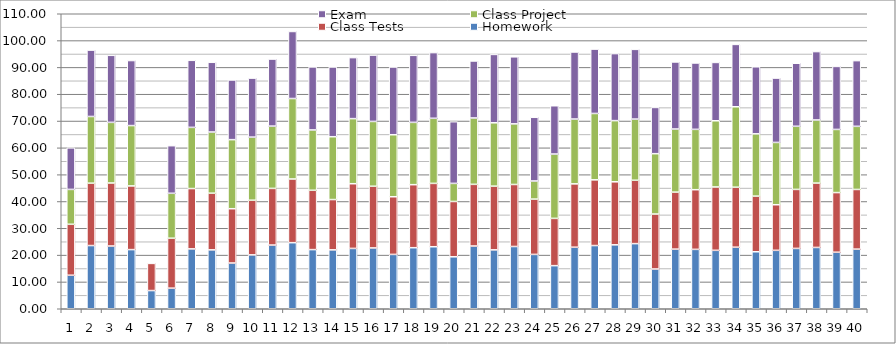
| Category | Homework | Class Tests | Class Project | Exam |
|---|---|---|---|---|
| 0 | 12.5 | 19 | 13 | 15.5 |
| 1 | 23.571 | 23.25 | 24.875 | 24.75 |
| 2 | 23.393 | 23.5 | 22.604 | 25 |
| 3 | 22.054 | 23.75 | 22.5 | 24.25 |
| 4 | 6.786 | 10.125 | 0 | 0 |
| 5 | 7.679 | 18.625 | 16.75 | 17.75 |
| 6 | 22.321 | 22.5 | 22.812 | 25 |
| 7 | 21.964 | 21.125 | 22.812 | 26 |
| 8 | 17.054 | 20.25 | 25.75 | 22.25 |
| 9 | 20.089 | 20.375 | 23.542 | 22 |
| 10 | 23.75 | 21.125 | 23.229 | 25 |
| 11 | 24.643 | 23.75 | 30 | 25 |
| 12 | 22.054 | 22.125 | 22.5 | 23.5 |
| 13 | 21.964 | 18.75 | 23.438 | 26 |
| 14 | 22.5 | 24.125 | 24.271 | 22.75 |
| 15 | 22.679 | 23 | 24.167 | 24.75 |
| 16 | 20.268 | 21.5 | 23.125 | 25.25 |
| 17 | 22.768 | 23.5 | 23.229 | 25 |
| 18 | 23.125 | 23.625 | 24.271 | 24.5 |
| 19 | 19.375 | 20.625 | 6.75 | 23 |
| 20 | 23.393 | 23 | 24.75 | 21.25 |
| 21 | 21.964 | 23.75 | 23.625 | 25.5 |
| 22 | 23.214 | 23.125 | 22.604 | 25 |
| 23 | 20.268 | 20.625 | 6.75 | 23.75 |
| 24 | 16.071 | 17.625 | 24 | 18 |
| 25 | 22.946 | 23.625 | 24.167 | 25 |
| 26 | 23.571 | 24.5 | 24.75 | 24 |
| 27 | 23.839 | 23.5 | 22.812 | 25 |
| 28 | 24.286 | 23.625 | 22.812 | 26 |
| 29 | 14.821 | 20.5 | 22.5 | 17.25 |
| 30 | 22.232 | 21.25 | 23.542 | 25 |
| 31 | 22.143 | 22.25 | 22.5 | 24.75 |
| 32 | 21.786 | 23.625 | 24.688 | 21.75 |
| 33 | 22.946 | 22.375 | 30 | 23.25 |
| 34 | 21.25 | 20.75 | 23.229 | 25 |
| 35 | 21.786 | 17 | 23.229 | 24 |
| 36 | 22.5 | 22 | 23.542 | 23.5 |
| 37 | 22.857 | 24 | 23.542 | 25.5 |
| 38 | 21.071 | 22.25 | 23.542 | 23.5 |
| 39 | 22.232 | 22.25 | 23.542 | 24.5 |